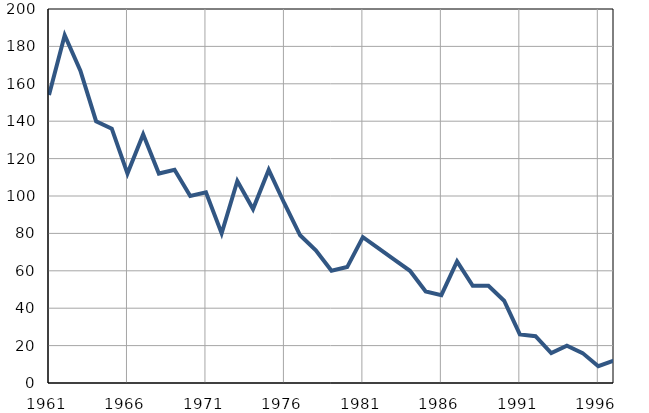
| Category | Умрла 
одојчад |
|---|---|
| 1961.0 | 154 |
| 1962.0 | 186 |
| 1963.0 | 167 |
| 1964.0 | 140 |
| 1965.0 | 136 |
| 1966.0 | 112 |
| 1967.0 | 133 |
| 1968.0 | 112 |
| 1969.0 | 114 |
| 1970.0 | 100 |
| 1971.0 | 102 |
| 1972.0 | 80 |
| 1973.0 | 108 |
| 1974.0 | 93 |
| 1975.0 | 114 |
| 1976.0 | 96 |
| 1977.0 | 79 |
| 1978.0 | 71 |
| 1979.0 | 60 |
| 1980.0 | 62 |
| 1981.0 | 78 |
| 1982.0 | 72 |
| 1983.0 | 66 |
| 1984.0 | 60 |
| 1985.0 | 49 |
| 1986.0 | 47 |
| 1987.0 | 65 |
| 1988.0 | 52 |
| 1989.0 | 52 |
| 1990.0 | 44 |
| 1991.0 | 26 |
| 1992.0 | 25 |
| 1993.0 | 16 |
| 1994.0 | 20 |
| 1995.0 | 16 |
| 1996.0 | 9 |
| 1997.0 | 12 |